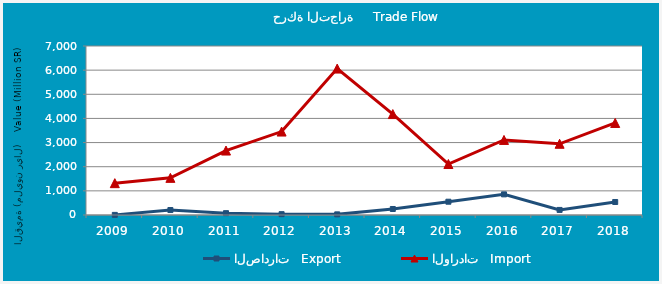
| Category | الصادرات   Export | الواردات   Import |
|---|---|---|
| 2009.0 | 5101162 | 1318384507 |
| 2010.0 | 205756857 | 1538234261 |
| 2011.0 | 76054266 | 2669422315 |
| 2012.0 | 34371421 | 3456007573 |
| 2013.0 | 26280730 | 6065408769 |
| 2014.0 | 248839480 | 4180752685 |
| 2015.0 | 550709482 | 2111673083 |
| 2016.0 | 854366959 | 3109390531 |
| 2017.0 | 209991428 | 2949421318 |
| 2018.0 | 538943859 | 3812517783 |